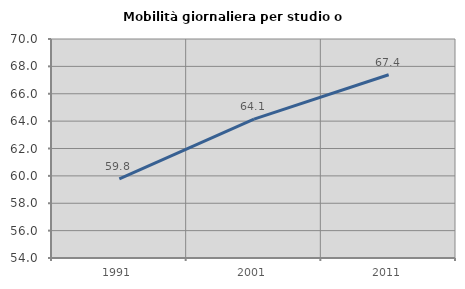
| Category | Mobilità giornaliera per studio o lavoro |
|---|---|
| 1991.0 | 59.773 |
| 2001.0 | 64.149 |
| 2011.0 | 67.389 |